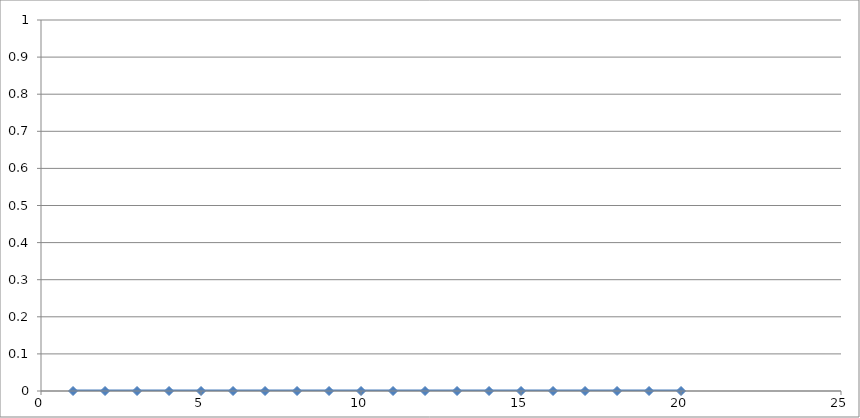
| Category | Series 0 |
|---|---|
| 0.0 | 2 |
| 1.0 | 1 |
| 2.0 | 0 |
| 3.0 | 1 |
| 4.0 | 0 |
| 5.0 | 1 |
| 6.0 | 2 |
| 7.0 | 1 |
| 8.0 | 2 |
| 9.0 | 1 |
| 10.0 | 2 |
| 11.0 | 1 |
| 12.0 | 0 |
| 13.0 | 1 |
| 14.0 | 0 |
| 15.0 | 1 |
| 16.0 | 2 |
| 17.0 | 1 |
| 18.0 | 0 |
| 19.0 | 1 |